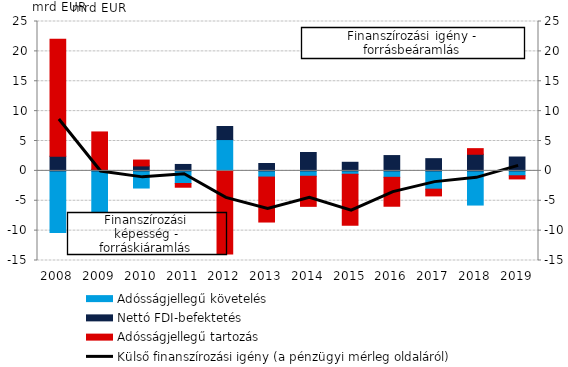
| Category | Adósságjellegű követelés | Nettó FDI-befektetés | Adósságjellegű tartozás |
|---|---|---|---|
| 2008.0 | -10.309 | 2.445 | 19.587 |
| 2009.0 | -6.97 | 0.259 | 6.258 |
| 2010.0 | -2.87 | 0.835 | 0.976 |
| 2011.0 | -2.116 | 1.076 | -0.621 |
| 2012.0 | 5.24 | 2.183 | -13.932 |
| 2013.0 | -1.033 | 1.232 | -7.528 |
| 2014.0 | -0.901 | 3.078 | -5.035 |
| 2015.0 | -0.567 | 1.438 | -8.546 |
| 2016.0 | -1.078 | 2.563 | -4.841 |
| 2017.0 | -3.063 | 2.044 | -1.126 |
| 2018.0 | -5.72 | 2.781 | 0.94 |
| 2019.0 | -0.818 | 2.32 | -0.528 |